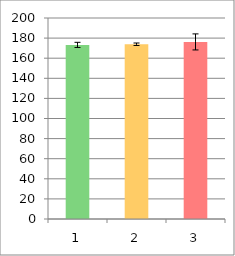
| Category | Series 0 |
|---|---|
| 0 | 173.242 |
| 1 | 173.896 |
| 2 | 176.204 |